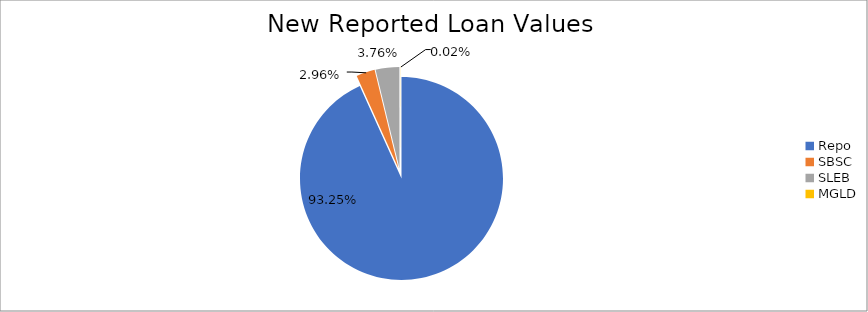
| Category | Series 0 |
|---|---|
| Repo | 9302553.86 |
| SBSC | 295440.248 |
| SLEB | 375571.334 |
| MGLD | 2421.651 |